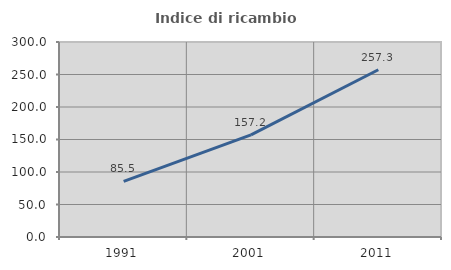
| Category | Indice di ricambio occupazionale  |
|---|---|
| 1991.0 | 85.536 |
| 2001.0 | 157.203 |
| 2011.0 | 257.269 |